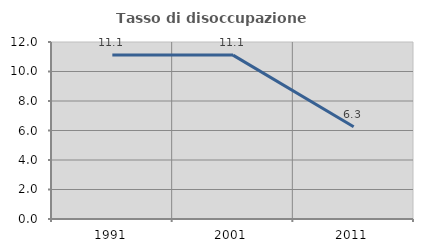
| Category | Tasso di disoccupazione giovanile  |
|---|---|
| 1991.0 | 11.111 |
| 2001.0 | 11.111 |
| 2011.0 | 6.25 |